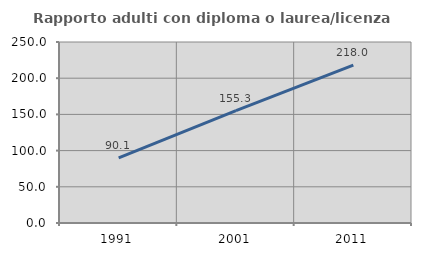
| Category | Rapporto adulti con diploma o laurea/licenza media  |
|---|---|
| 1991.0 | 90.095 |
| 2001.0 | 155.319 |
| 2011.0 | 218.006 |